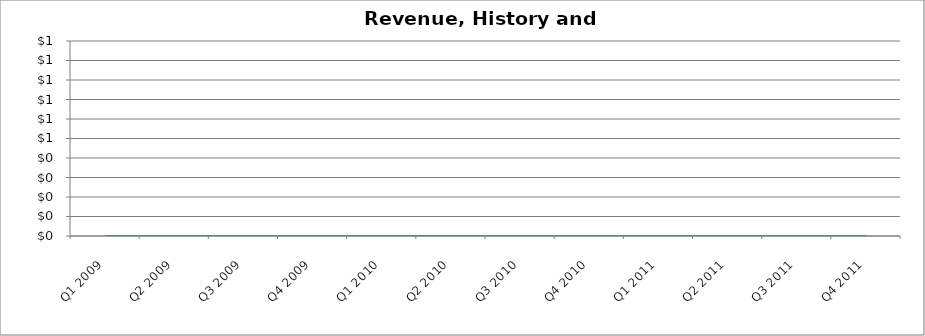
| Category | Revenue |
|---|---|
| Q1 2009 | 0 |
| Q2 2009 | 0 |
| Q3 2009 | 0 |
| Q4 2009 | 0 |
| Q1 2010 | 0 |
| Q2 2010 | 0 |
| Q3 2010 | 0 |
| Q4 2010 | 0 |
| Q1 2011 | 0 |
| Q2 2011 | 0 |
| Q3 2011 | 0 |
| Q4 2011 | 0 |